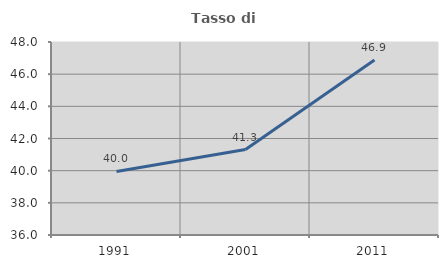
| Category | Tasso di occupazione   |
|---|---|
| 1991.0 | 39.953 |
| 2001.0 | 41.314 |
| 2011.0 | 46.875 |